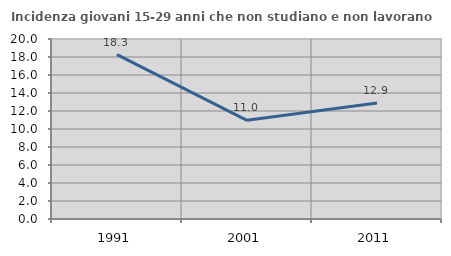
| Category | Incidenza giovani 15-29 anni che non studiano e non lavorano  |
|---|---|
| 1991.0 | 18.268 |
| 2001.0 | 10.96 |
| 2011.0 | 12.886 |